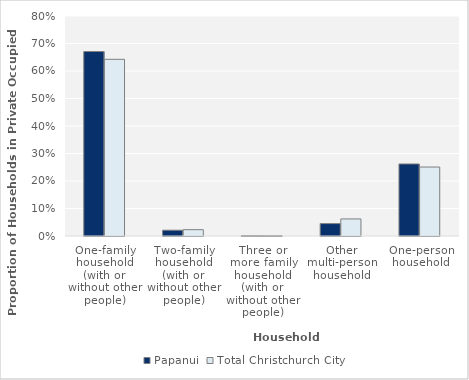
| Category | Papanui | Total Christchurch City |
|---|---|---|
| One-family household (with or without other people) | 0.671 |  |
| Two-family household (with or without other people) | 0.021 |  |
| Three or more family household (with or without other people) | 0.001 |  |
| Other multi-person household | 0.045 |  |
| One-person household | 0.262 |  |